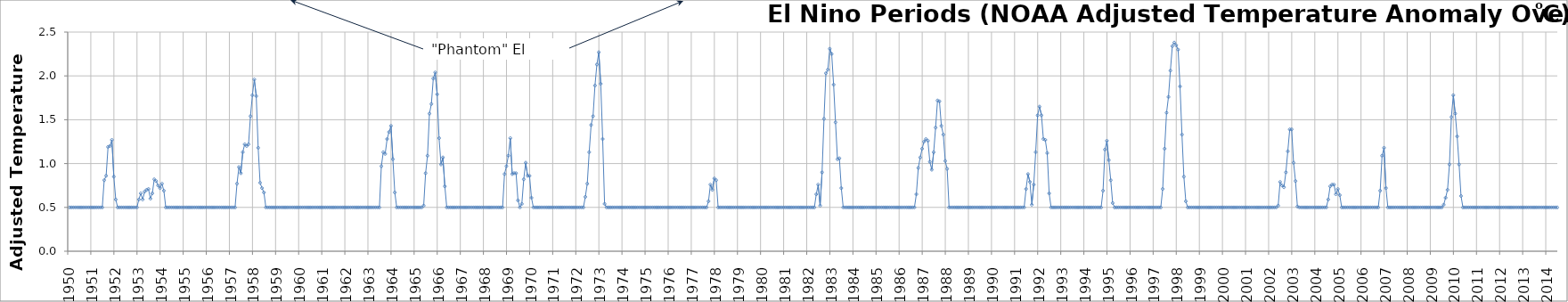
| Category | El Nino Periods |
|---|---|
| 1950.0 | 0.5 |
| 1950.0 | 0.5 |
| 1950.0 | 0.5 |
| 1950.0 | 0.5 |
| 1950.0 | 0.5 |
| 1950.0 | 0.5 |
| 1950.0 | 0.5 |
| 1950.0 | 0.5 |
| 1950.0 | 0.5 |
| 1950.0 | 0.5 |
| 1950.0 | 0.5 |
| 1950.0 | 0.5 |
| 1951.0 | 0.5 |
| 1951.0 | 0.5 |
| 1951.0 | 0.5 |
| 1951.0 | 0.5 |
| 1951.0 | 0.5 |
| 1951.0 | 0.5 |
| 1951.0 | 0.81 |
| 1951.0 | 0.86 |
| 1951.0 | 1.19 |
| 1951.0 | 1.2 |
| 1951.0 | 1.27 |
| 1951.0 | 0.85 |
| 1952.0 | 0.59 |
| 1952.0 | 0.5 |
| 1952.0 | 0.5 |
| 1952.0 | 0.5 |
| 1952.0 | 0.5 |
| 1952.0 | 0.5 |
| 1952.0 | 0.5 |
| 1952.0 | 0.5 |
| 1952.0 | 0.5 |
| 1952.0 | 0.5 |
| 1952.0 | 0.5 |
| 1952.0 | 0.5 |
| 1953.0 | 0.59 |
| 1953.0 | 0.66 |
| 1953.0 | 0.59 |
| 1953.0 | 0.68 |
| 1953.0 | 0.7 |
| 1953.0 | 0.71 |
| 1953.0 | 0.6 |
| 1953.0 | 0.66 |
| 1953.0 | 0.82 |
| 1953.0 | 0.8 |
| 1953.0 | 0.75 |
| 1953.0 | 0.72 |
| 1954.0 | 0.77 |
| 1954.0 | 0.69 |
| 1954.0 | 0.5 |
| 1954.0 | 0.5 |
| 1954.0 | 0.5 |
| 1954.0 | 0.5 |
| 1954.0 | 0.5 |
| 1954.0 | 0.5 |
| 1954.0 | 0.5 |
| 1954.0 | 0.5 |
| 1954.0 | 0.5 |
| 1954.0 | 0.5 |
| 1955.0 | 0.5 |
| 1955.0 | 0.5 |
| 1955.0 | 0.5 |
| 1955.0 | 0.5 |
| 1955.0 | 0.5 |
| 1955.0 | 0.5 |
| 1955.0 | 0.5 |
| 1955.0 | 0.5 |
| 1955.0 | 0.5 |
| 1955.0 | 0.5 |
| 1955.0 | 0.5 |
| 1955.0 | 0.5 |
| 1956.0 | 0.5 |
| 1956.0 | 0.5 |
| 1956.0 | 0.5 |
| 1956.0 | 0.5 |
| 1956.0 | 0.5 |
| 1956.0 | 0.5 |
| 1956.0 | 0.5 |
| 1956.0 | 0.5 |
| 1956.0 | 0.5 |
| 1956.0 | 0.5 |
| 1956.0 | 0.5 |
| 1956.0 | 0.5 |
| 1957.0 | 0.5 |
| 1957.0 | 0.5 |
| 1957.0 | 0.5 |
| 1957.0 | 0.77 |
| 1957.0 | 0.96 |
| 1957.0 | 0.89 |
| 1957.0 | 1.13 |
| 1957.0 | 1.22 |
| 1957.0 | 1.2 |
| 1957.0 | 1.22 |
| 1957.0 | 1.54 |
| 1957.0 | 1.78 |
| 1958.0 | 1.96 |
| 1958.0 | 1.77 |
| 1958.0 | 1.18 |
| 1958.0 | 0.78 |
| 1958.0 | 0.72 |
| 1958.0 | 0.67 |
| 1958.0 | 0.5 |
| 1958.0 | 0.5 |
| 1958.0 | 0.5 |
| 1958.0 | 0.5 |
| 1958.0 | 0.5 |
| 1958.0 | 0.5 |
| 1959.0 | 0.5 |
| 1959.0 | 0.5 |
| 1959.0 | 0.5 |
| 1959.0 | 0.5 |
| 1959.0 | 0.5 |
| 1959.0 | 0.5 |
| 1959.0 | 0.5 |
| 1959.0 | 0.5 |
| 1959.0 | 0.5 |
| 1959.0 | 0.5 |
| 1959.0 | 0.5 |
| 1959.0 | 0.5 |
| 1960.0 | 0.5 |
| 1960.0 | 0.5 |
| 1960.0 | 0.5 |
| 1960.0 | 0.5 |
| 1960.0 | 0.5 |
| 1960.0 | 0.5 |
| 1960.0 | 0.5 |
| 1960.0 | 0.5 |
| 1960.0 | 0.5 |
| 1960.0 | 0.5 |
| 1960.0 | 0.5 |
| 1960.0 | 0.5 |
| 1961.0 | 0.5 |
| 1961.0 | 0.5 |
| 1961.0 | 0.5 |
| 1961.0 | 0.5 |
| 1961.0 | 0.5 |
| 1961.0 | 0.5 |
| 1961.0 | 0.5 |
| 1961.0 | 0.5 |
| 1961.0 | 0.5 |
| 1961.0 | 0.5 |
| 1961.0 | 0.5 |
| 1961.0 | 0.5 |
| 1962.0 | 0.5 |
| 1962.0 | 0.5 |
| 1962.0 | 0.5 |
| 1962.0 | 0.5 |
| 1962.0 | 0.5 |
| 1962.0 | 0.5 |
| 1962.0 | 0.5 |
| 1962.0 | 0.5 |
| 1962.0 | 0.5 |
| 1962.0 | 0.5 |
| 1962.0 | 0.5 |
| 1962.0 | 0.5 |
| 1963.0 | 0.5 |
| 1963.0 | 0.5 |
| 1963.0 | 0.5 |
| 1963.0 | 0.5 |
| 1963.0 | 0.5 |
| 1963.0 | 0.5 |
| 1963.0 | 0.97 |
| 1963.0 | 1.13 |
| 1963.0 | 1.11 |
| 1963.0 | 1.28 |
| 1963.0 | 1.36 |
| 1963.0 | 1.43 |
| 1964.0 | 1.05 |
| 1964.0 | 0.67 |
| 1964.0 | 0.5 |
| 1964.0 | 0.5 |
| 1964.0 | 0.5 |
| 1964.0 | 0.5 |
| 1964.0 | 0.5 |
| 1964.0 | 0.5 |
| 1964.0 | 0.5 |
| 1964.0 | 0.5 |
| 1964.0 | 0.5 |
| 1964.0 | 0.5 |
| 1965.0 | 0.5 |
| 1965.0 | 0.5 |
| 1965.0 | 0.5 |
| 1965.0 | 0.5 |
| 1965.0 | 0.52 |
| 1965.0 | 0.89 |
| 1965.0 | 1.09 |
| 1965.0 | 1.57 |
| 1965.0 | 1.68 |
| 1965.0 | 1.97 |
| 1965.0 | 2.04 |
| 1965.0 | 1.79 |
| 1966.0 | 1.29 |
| 1966.0 | 0.99 |
| 1966.0 | 1.07 |
| 1966.0 | 0.74 |
| 1966.0 | 0.5 |
| 1966.0 | 0.5 |
| 1966.0 | 0.5 |
| 1966.0 | 0.5 |
| 1966.0 | 0.5 |
| 1966.0 | 0.5 |
| 1966.0 | 0.5 |
| 1966.0 | 0.5 |
| 1967.0 | 0.5 |
| 1967.0 | 0.5 |
| 1967.0 | 0.5 |
| 1967.0 | 0.5 |
| 1967.0 | 0.5 |
| 1967.0 | 0.5 |
| 1967.0 | 0.5 |
| 1967.0 | 0.5 |
| 1967.0 | 0.5 |
| 1967.0 | 0.5 |
| 1967.0 | 0.5 |
| 1967.0 | 0.5 |
| 1968.0 | 0.5 |
| 1968.0 | 0.5 |
| 1968.0 | 0.5 |
| 1968.0 | 0.5 |
| 1968.0 | 0.5 |
| 1968.0 | 0.5 |
| 1968.0 | 0.5 |
| 1968.0 | 0.5 |
| 1968.0 | 0.5 |
| 1968.0 | 0.5 |
| 1968.0 | 0.88 |
| 1968.0 | 0.97 |
| 1969.0 | 1.09 |
| 1969.0 | 1.29 |
| 1969.0 | 0.88 |
| 1969.0 | 0.89 |
| 1969.0 | 0.89 |
| 1969.0 | 0.58 |
| 1969.0 | 0.5 |
| 1969.0 | 0.54 |
| 1969.0 | 0.82 |
| 1969.0 | 1.01 |
| 1969.0 | 0.86 |
| 1969.0 | 0.86 |
| 1970.0 | 0.61 |
| 1970.0 | 0.5 |
| 1970.0 | 0.5 |
| 1970.0 | 0.5 |
| 1970.0 | 0.5 |
| 1970.0 | 0.5 |
| 1970.0 | 0.5 |
| 1970.0 | 0.5 |
| 1970.0 | 0.5 |
| 1970.0 | 0.5 |
| 1970.0 | 0.5 |
| 1970.0 | 0.5 |
| 1971.0 | 0.5 |
| 1971.0 | 0.5 |
| 1971.0 | 0.5 |
| 1971.0 | 0.5 |
| 1971.0 | 0.5 |
| 1971.0 | 0.5 |
| 1971.0 | 0.5 |
| 1971.0 | 0.5 |
| 1971.0 | 0.5 |
| 1971.0 | 0.5 |
| 1971.0 | 0.5 |
| 1971.0 | 0.5 |
| 1972.0 | 0.5 |
| 1972.0 | 0.5 |
| 1972.0 | 0.5 |
| 1972.0 | 0.5 |
| 1972.0 | 0.62 |
| 1972.0 | 0.77 |
| 1972.0 | 1.13 |
| 1972.0 | 1.44 |
| 1972.0 | 1.54 |
| 1972.0 | 1.89 |
| 1972.0 | 2.13 |
| 1972.0 | 2.27 |
| 1973.0 | 1.91 |
| 1973.0 | 1.28 |
| 1973.0 | 0.54 |
| 1973.0 | 0.5 |
| 1973.0 | 0.5 |
| 1973.0 | 0.5 |
| 1973.0 | 0.5 |
| 1973.0 | 0.5 |
| 1973.0 | 0.5 |
| 1973.0 | 0.5 |
| 1973.0 | 0.5 |
| 1973.0 | 0.5 |
| 1974.0 | 0.5 |
| 1974.0 | 0.5 |
| 1974.0 | 0.5 |
| 1974.0 | 0.5 |
| 1974.0 | 0.5 |
| 1974.0 | 0.5 |
| 1974.0 | 0.5 |
| 1974.0 | 0.5 |
| 1974.0 | 0.5 |
| 1974.0 | 0.5 |
| 1974.0 | 0.5 |
| 1974.0 | 0.5 |
| 1975.0 | 0.5 |
| 1975.0 | 0.5 |
| 1975.0 | 0.5 |
| 1975.0 | 0.5 |
| 1975.0 | 0.5 |
| 1975.0 | 0.5 |
| 1975.0 | 0.5 |
| 1975.0 | 0.5 |
| 1975.0 | 0.5 |
| 1975.0 | 0.5 |
| 1975.0 | 0.5 |
| 1975.0 | 0.5 |
| 1976.0 | 0.5 |
| 1976.0 | 0.5 |
| 1976.0 | 0.5 |
| 1976.0 | 0.5 |
| 1976.0 | 0.5 |
| 1976.0 | 0.5 |
| 1976.0 | 0.5 |
| 1976.0 | 0.5 |
| 1976.0 | 0.5 |
| 1976.0 | 0.5 |
| 1976.0 | 0.5 |
| 1976.0 | 0.5 |
| 1977.0 | 0.5 |
| 1977.0 | 0.5 |
| 1977.0 | 0.5 |
| 1977.0 | 0.5 |
| 1977.0 | 0.5 |
| 1977.0 | 0.5 |
| 1977.0 | 0.5 |
| 1977.0 | 0.5 |
| 1977.0 | 0.57 |
| 1977.0 | 0.76 |
| 1977.0 | 0.7 |
| 1977.0 | 0.83 |
| 1978.0 | 0.81 |
| 1978.0 | 0.5 |
| 1978.0 | 0.5 |
| 1978.0 | 0.5 |
| 1978.0 | 0.5 |
| 1978.0 | 0.5 |
| 1978.0 | 0.5 |
| 1978.0 | 0.5 |
| 1978.0 | 0.5 |
| 1978.0 | 0.5 |
| 1978.0 | 0.5 |
| 1978.0 | 0.5 |
| 1979.0 | 0.5 |
| 1979.0 | 0.5 |
| 1979.0 | 0.5 |
| 1979.0 | 0.5 |
| 1979.0 | 0.5 |
| 1979.0 | 0.5 |
| 1979.0 | 0.5 |
| 1979.0 | 0.5 |
| 1979.0 | 0.5 |
| 1979.0 | 0.5 |
| 1979.0 | 0.5 |
| 1979.0 | 0.5 |
| 1980.0 | 0.5 |
| 1980.0 | 0.5 |
| 1980.0 | 0.5 |
| 1980.0 | 0.5 |
| 1980.0 | 0.5 |
| 1980.0 | 0.5 |
| 1980.0 | 0.5 |
| 1980.0 | 0.5 |
| 1980.0 | 0.5 |
| 1980.0 | 0.5 |
| 1980.0 | 0.5 |
| 1980.0 | 0.5 |
| 1981.0 | 0.5 |
| 1981.0 | 0.5 |
| 1981.0 | 0.5 |
| 1981.0 | 0.5 |
| 1981.0 | 0.5 |
| 1981.0 | 0.5 |
| 1981.0 | 0.5 |
| 1981.0 | 0.5 |
| 1981.0 | 0.5 |
| 1981.0 | 0.5 |
| 1981.0 | 0.5 |
| 1981.0 | 0.5 |
| 1982.0 | 0.5 |
| 1982.0 | 0.5 |
| 1982.0 | 0.5 |
| 1982.0 | 0.5 |
| 1982.0 | 0.65 |
| 1982.0 | 0.76 |
| 1982.0 | 0.52 |
| 1982.0 | 0.9 |
| 1982.0 | 1.51 |
| 1982.0 | 2.03 |
| 1982.0 | 2.07 |
| 1982.0 | 2.31 |
| 1983.0 | 2.25 |
| 1983.0 | 1.9 |
| 1983.0 | 1.47 |
| 1983.0 | 1.05 |
| 1983.0 | 1.06 |
| 1983.0 | 0.72 |
| 1983.0 | 0.5 |
| 1983.0 | 0.5 |
| 1983.0 | 0.5 |
| 1983.0 | 0.5 |
| 1983.0 | 0.5 |
| 1983.0 | 0.5 |
| 1984.0 | 0.5 |
| 1984.0 | 0.5 |
| 1984.0 | 0.5 |
| 1984.0 | 0.5 |
| 1984.0 | 0.5 |
| 1984.0 | 0.5 |
| 1984.0 | 0.5 |
| 1984.0 | 0.5 |
| 1984.0 | 0.5 |
| 1984.0 | 0.5 |
| 1984.0 | 0.5 |
| 1984.0 | 0.5 |
| 1985.0 | 0.5 |
| 1985.0 | 0.5 |
| 1985.0 | 0.5 |
| 1985.0 | 0.5 |
| 1985.0 | 0.5 |
| 1985.0 | 0.5 |
| 1985.0 | 0.5 |
| 1985.0 | 0.5 |
| 1985.0 | 0.5 |
| 1985.0 | 0.5 |
| 1985.0 | 0.5 |
| 1985.0 | 0.5 |
| 1986.0 | 0.5 |
| 1986.0 | 0.5 |
| 1986.0 | 0.5 |
| 1986.0 | 0.5 |
| 1986.0 | 0.5 |
| 1986.0 | 0.5 |
| 1986.0 | 0.5 |
| 1986.0 | 0.5 |
| 1986.0 | 0.65 |
| 1986.0 | 0.95 |
| 1986.0 | 1.07 |
| 1986.0 | 1.17 |
| 1987.0 | 1.25 |
| 1987.0 | 1.28 |
| 1987.0 | 1.26 |
| 1987.0 | 1.02 |
| 1987.0 | 0.93 |
| 1987.0 | 1.13 |
| 1987.0 | 1.41 |
| 1987.0 | 1.72 |
| 1987.0 | 1.71 |
| 1987.0 | 1.43 |
| 1987.0 | 1.33 |
| 1987.0 | 1.03 |
| 1988.0 | 0.94 |
| 1988.0 | 0.5 |
| 1988.0 | 0.5 |
| 1988.0 | 0.5 |
| 1988.0 | 0.5 |
| 1988.0 | 0.5 |
| 1988.0 | 0.5 |
| 1988.0 | 0.5 |
| 1988.0 | 0.5 |
| 1988.0 | 0.5 |
| 1988.0 | 0.5 |
| 1988.0 | 0.5 |
| 1989.0 | 0.5 |
| 1989.0 | 0.5 |
| 1989.0 | 0.5 |
| 1989.0 | 0.5 |
| 1989.0 | 0.5 |
| 1989.0 | 0.5 |
| 1989.0 | 0.5 |
| 1989.0 | 0.5 |
| 1989.0 | 0.5 |
| 1989.0 | 0.5 |
| 1989.0 | 0.5 |
| 1989.0 | 0.5 |
| 1990.0 | 0.5 |
| 1990.0 | 0.5 |
| 1990.0 | 0.5 |
| 1990.0 | 0.5 |
| 1990.0 | 0.5 |
| 1990.0 | 0.5 |
| 1990.0 | 0.5 |
| 1990.0 | 0.5 |
| 1990.0 | 0.5 |
| 1990.0 | 0.5 |
| 1990.0 | 0.5 |
| 1990.0 | 0.5 |
| 1991.0 | 0.5 |
| 1991.0 | 0.5 |
| 1991.0 | 0.5 |
| 1991.0 | 0.5 |
| 1991.0 | 0.5 |
| 1991.0 | 0.71 |
| 1991.0 | 0.88 |
| 1991.0 | 0.79 |
| 1991.0 | 0.53 |
| 1991.0 | 0.76 |
| 1991.0 | 1.13 |
| 1991.0 | 1.55 |
| 1992.0 | 1.65 |
| 1992.0 | 1.55 |
| 1992.0 | 1.28 |
| 1992.0 | 1.27 |
| 1992.0 | 1.12 |
| 1992.0 | 0.66 |
| 1992.0 | 0.5 |
| 1992.0 | 0.5 |
| 1992.0 | 0.5 |
| 1992.0 | 0.5 |
| 1992.0 | 0.5 |
| 1992.0 | 0.5 |
| 1993.0 | 0.5 |
| 1993.0 | 0.5 |
| 1993.0 | 0.5 |
| 1993.0 | 0.5 |
| 1993.0 | 0.5 |
| 1993.0 | 0.5 |
| 1993.0 | 0.5 |
| 1993.0 | 0.5 |
| 1993.0 | 0.5 |
| 1993.0 | 0.5 |
| 1993.0 | 0.5 |
| 1993.0 | 0.5 |
| 1994.0 | 0.5 |
| 1994.0 | 0.5 |
| 1994.0 | 0.5 |
| 1994.0 | 0.5 |
| 1994.0 | 0.5 |
| 1994.0 | 0.5 |
| 1994.0 | 0.5 |
| 1994.0 | 0.5 |
| 1994.0 | 0.5 |
| 1994.0 | 0.69 |
| 1994.0 | 1.16 |
| 1994.0 | 1.26 |
| 1995.0 | 1.04 |
| 1995.0 | 0.81 |
| 1995.0 | 0.55 |
| 1995.0 | 0.5 |
| 1995.0 | 0.5 |
| 1995.0 | 0.5 |
| 1995.0 | 0.5 |
| 1995.0 | 0.5 |
| 1995.0 | 0.5 |
| 1995.0 | 0.5 |
| 1995.0 | 0.5 |
| 1995.0 | 0.5 |
| 1996.0 | 0.5 |
| 1996.0 | 0.5 |
| 1996.0 | 0.5 |
| 1996.0 | 0.5 |
| 1996.0 | 0.5 |
| 1996.0 | 0.5 |
| 1996.0 | 0.5 |
| 1996.0 | 0.5 |
| 1996.0 | 0.5 |
| 1996.0 | 0.5 |
| 1996.0 | 0.5 |
| 1996.0 | 0.5 |
| 1997.0 | 0.5 |
| 1997.0 | 0.5 |
| 1997.0 | 0.5 |
| 1997.0 | 0.5 |
| 1997.0 | 0.71 |
| 1997.0 | 1.17 |
| 1997.0 | 1.58 |
| 1997.0 | 1.76 |
| 1997.0 | 2.06 |
| 1997.0 | 2.34 |
| 1997.0 | 2.38 |
| 1997.0 | 2.35 |
| 1998.0 | 2.3 |
| 1998.0 | 1.88 |
| 1998.0 | 1.33 |
| 1998.0 | 0.85 |
| 1998.0 | 0.57 |
| 1998.0 | 0.5 |
| 1998.0 | 0.5 |
| 1998.0 | 0.5 |
| 1998.0 | 0.5 |
| 1998.0 | 0.5 |
| 1998.0 | 0.5 |
| 1998.0 | 0.5 |
| 1999.0 | 0.5 |
| 1999.0 | 0.5 |
| 1999.0 | 0.5 |
| 1999.0 | 0.5 |
| 1999.0 | 0.5 |
| 1999.0 | 0.5 |
| 1999.0 | 0.5 |
| 1999.0 | 0.5 |
| 1999.0 | 0.5 |
| 1999.0 | 0.5 |
| 1999.0 | 0.5 |
| 1999.0 | 0.5 |
| 2000.0 | 0.5 |
| 2000.0 | 0.5 |
| 2000.0 | 0.5 |
| 2000.0 | 0.5 |
| 2000.0 | 0.5 |
| 2000.0 | 0.5 |
| 2000.0 | 0.5 |
| 2000.0 | 0.5 |
| 2000.0 | 0.5 |
| 2000.0 | 0.5 |
| 2000.0 | 0.5 |
| 2000.0 | 0.5 |
| 2001.0 | 0.5 |
| 2001.0 | 0.5 |
| 2001.0 | 0.5 |
| 2001.0 | 0.5 |
| 2001.0 | 0.5 |
| 2001.0 | 0.5 |
| 2001.0 | 0.5 |
| 2001.0 | 0.5 |
| 2001.0 | 0.5 |
| 2001.0 | 0.5 |
| 2001.0 | 0.5 |
| 2001.0 | 0.5 |
| 2002.0 | 0.5 |
| 2002.0 | 0.5 |
| 2002.0 | 0.5 |
| 2002.0 | 0.5 |
| 2002.0 | 0.52 |
| 2002.0 | 0.79 |
| 2002.0 | 0.75 |
| 2002.0 | 0.73 |
| 2002.0 | 0.9 |
| 2002.0 | 1.14 |
| 2002.0 | 1.39 |
| 2002.0 | 1.39 |
| 2003.0 | 1.01 |
| 2003.0 | 0.8 |
| 2003.0 | 0.51 |
| 2003.0 | 0.5 |
| 2003.0 | 0.5 |
| 2003.0 | 0.5 |
| 2003.0 | 0.5 |
| 2003.0 | 0.5 |
| 2003.0 | 0.5 |
| 2003.0 | 0.5 |
| 2003.0 | 0.5 |
| 2003.0 | 0.5 |
| 2004.0 | 0.5 |
| 2004.0 | 0.5 |
| 2004.0 | 0.5 |
| 2004.0 | 0.5 |
| 2004.0 | 0.5 |
| 2004.0 | 0.5 |
| 2004.0 | 0.59 |
| 2004.0 | 0.74 |
| 2004.0 | 0.76 |
| 2004.0 | 0.76 |
| 2004.0 | 0.65 |
| 2004.0 | 0.71 |
| 2005.0 | 0.64 |
| 2005.0 | 0.5 |
| 2005.0 | 0.5 |
| 2005.0 | 0.5 |
| 2005.0 | 0.5 |
| 2005.0 | 0.5 |
| 2005.0 | 0.5 |
| 2005.0 | 0.5 |
| 2005.0 | 0.5 |
| 2005.0 | 0.5 |
| 2005.0 | 0.5 |
| 2005.0 | 0.5 |
| 2006.0 | 0.5 |
| 2006.0 | 0.5 |
| 2006.0 | 0.5 |
| 2006.0 | 0.5 |
| 2006.0 | 0.5 |
| 2006.0 | 0.5 |
| 2006.0 | 0.5 |
| 2006.0 | 0.5 |
| 2006.0 | 0.5 |
| 2006.0 | 0.69 |
| 2006.0 | 1.09 |
| 2006.0 | 1.18 |
| 2007.0 | 0.72 |
| 2007.0 | 0.5 |
| 2007.0 | 0.5 |
| 2007.0 | 0.5 |
| 2007.0 | 0.5 |
| 2007.0 | 0.5 |
| 2007.0 | 0.5 |
| 2007.0 | 0.5 |
| 2007.0 | 0.5 |
| 2007.0 | 0.5 |
| 2007.0 | 0.5 |
| 2007.0 | 0.5 |
| 2008.0 | 0.5 |
| 2008.0 | 0.5 |
| 2008.0 | 0.5 |
| 2008.0 | 0.5 |
| 2008.0 | 0.5 |
| 2008.0 | 0.5 |
| 2008.0 | 0.5 |
| 2008.0 | 0.5 |
| 2008.0 | 0.5 |
| 2008.0 | 0.5 |
| 2008.0 | 0.5 |
| 2008.0 | 0.5 |
| 2009.0 | 0.5 |
| 2009.0 | 0.5 |
| 2009.0 | 0.5 |
| 2009.0 | 0.5 |
| 2009.0 | 0.5 |
| 2009.0 | 0.5 |
| 2009.0 | 0.53 |
| 2009.0 | 0.61 |
| 2009.0 | 0.7 |
| 2009.0 | 0.99 |
| 2009.0 | 1.53 |
| 2009.0 | 1.78 |
| 2010.0 | 1.57 |
| 2010.0 | 1.31 |
| 2010.0 | 0.99 |
| 2010.0 | 0.63 |
| 2010.0 | 0.5 |
| 2010.0 | 0.5 |
| 2010.0 | 0.5 |
| 2010.0 | 0.5 |
| 2010.0 | 0.5 |
| 2010.0 | 0.5 |
| 2010.0 | 0.5 |
| 2010.0 | 0.5 |
| 2011.0 | 0.5 |
| 2011.0 | 0.5 |
| 2011.0 | 0.5 |
| 2011.0 | 0.5 |
| 2011.0 | 0.5 |
| 2011.0 | 0.5 |
| 2011.0 | 0.5 |
| 2011.0 | 0.5 |
| 2011.0 | 0.5 |
| 2011.0 | 0.5 |
| 2011.0 | 0.5 |
| 2011.0 | 0.5 |
| 2012.0 | 0.5 |
| 2012.0 | 0.5 |
| 2012.0 | 0.5 |
| 2012.0 | 0.5 |
| 2012.0 | 0.5 |
| 2012.0 | 0.5 |
| 2012.0 | 0.5 |
| 2012.0 | 0.5 |
| 2012.0 | 0.5 |
| 2012.0 | 0.5 |
| 2012.0 | 0.5 |
| 2012.0 | 0.5 |
| 2013.0 | 0.5 |
| 2013.0 | 0.5 |
| 2013.0 | 0.5 |
| 2013.0 | 0.5 |
| 2013.0 | 0.5 |
| 2013.0 | 0.5 |
| 2013.0 | 0.5 |
| 2013.0 | 0.5 |
| 2013.0 | 0.5 |
| 2013.0 | 0.5 |
| 2013.0 | 0.5 |
| 2013.0 | 0.5 |
| 2014.0 | 0.5 |
| 2014.0 | 0.5 |
| 2014.0 | 0.5 |
| 2014.0 | 0.5 |
| 2014.0 | 0.5 |
| 2014.0 | 0.5 |